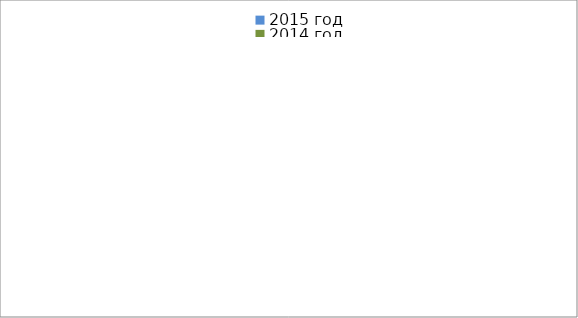
| Category | 2015 год | 2014 год |
|---|---|---|
|  - поджог | 18 | 16 |
|  - неосторожное обращение с огнём | 49 | 29 |
|  - НПТЭ электрооборудования | 8 | 17 |
|  - НПУ и Э печей | 45 | 49 |
|  - НПУ и Э транспортных средств | 39 | 47 |
|   -Шалость с огнем детей | 3 | 0 |
|  -НППБ при эксплуатации эл.приборов | 11 | 17 |
|  - курение | 19 | 18 |
| - прочие | 77 | 73 |
| - не установленные причины | 8 | 7 |